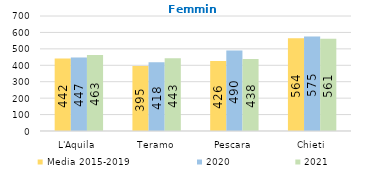
| Category | Media 2015-2019  | 2020 | 2021 |
|---|---|---|---|
| L'Aquila | 441.6 | 447 | 463 |
| Teramo | 395.2 | 418 | 443 |
| Pescara | 425.6 | 490 | 438 |
| Chieti | 564.4 | 575 | 561 |